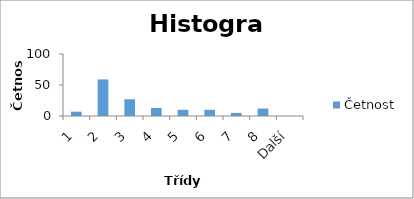
| Category | Četnost |
|---|---|
| 1 | 7 |
| 2 | 59 |
| 3 | 27 |
| 4 | 13 |
| 5 | 10 |
| 6 | 10 |
| 7 | 5 |
| 8 | 12 |
| Další | 0 |